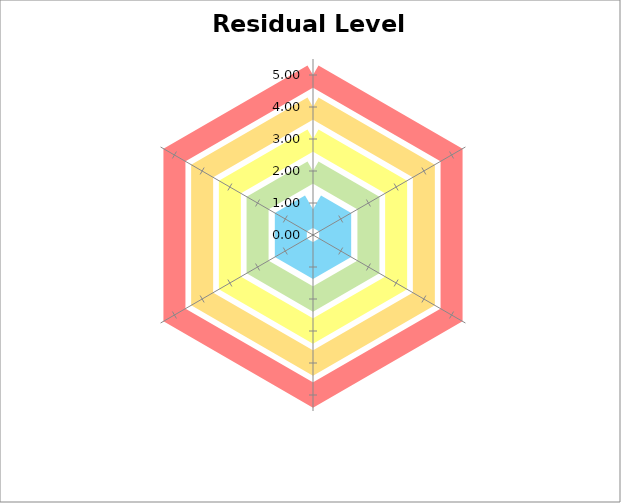
| Category | B | G | Y | O | R |
|---|---|---|---|---|---|
| La personne concernée | 0.8 | 2 | 3 | 4 | 5 |
| Le responsable du traitement et le sous-traitant  | 0.8 | 2 | 3 | 4 | 5 |
| Portabilité et transfert (tiers - international)  | 0.8 | 2 | 3 | 4 | 5 |
| Système de traitement et processus opérationnels (technique - business)  | 0.8 | 2 | 3 | 4 | 5 |
| Le traitement (le concept)  | 0.8 | 2 | 3 | 4 | 5 |
| La gouvernance RGPD (continue) | 0.8 | 2 | 3 | 4 | 5 |